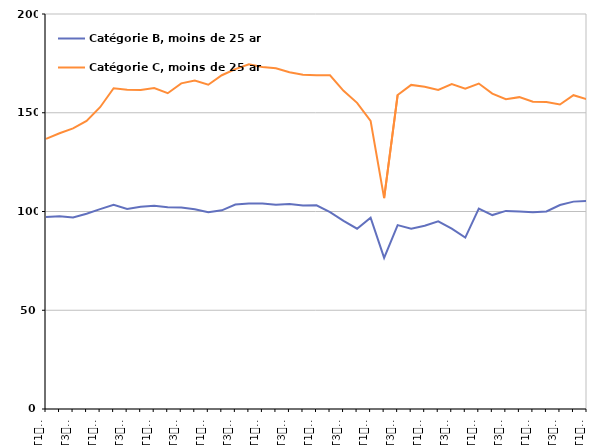
| Category | Catégorie B, moins de 25 ans | Catégorie C, moins de 25 ans |
|---|---|---|
| T1
2014 | 97.2 | 136.8 |
| T2
2014 | 97.6 | 139.6 |
| T3
2014 | 97 | 142.1 |
| T4
2014 | 98.9 | 145.9 |
| T1
2015 | 101.2 | 152.8 |
| T2
2015 | 103.4 | 162.4 |
| T3
2015 | 101.3 | 161.7 |
| T4
2015 | 102.4 | 161.5 |
| T1
2016 | 102.9 | 162.5 |
| T2
2016 | 102.2 | 159.9 |
| T3
2016 | 102 | 164.9 |
| T4
2016 | 101.1 | 166.3 |
| T1
2017 | 99.6 | 164.2 |
| T2
2017 | 100.6 | 169 |
| T3
2017 | 103.5 | 172.1 |
| T4
2017 | 104 | 174.5 |
| T1
2018 | 104.1 | 173.2 |
| T2
2018 | 103.4 | 172.5 |
| T3
2018 | 103.8 | 170.5 |
| T4
2018 | 103 | 169.3 |
| T1
2019 | 103.1 | 169 |
| T2
2019 | 99.7 | 169 |
| T3
2019 | 95.3 | 161.1 |
| T4
2019 | 91.3 | 155 |
| T1
2020 | 96.9 | 145.9 |
| T2
2020 | 76.5 | 106.8 |
| T3
2020 | 93.1 | 159 |
| T4
2020 | 91.3 | 164.1 |
| T1
2021 | 92.8 | 163.2 |
| T2
2021 | 95 | 161.5 |
| T3
2021 | 91.3 | 164.5 |
| T4
2021 | 86.8 | 162.2 |
| T1
2022 | 101.5 | 164.8 |
| T2
2022 | 98.2 | 159.7 |
| T3
2022 | 100.3 | 156.9 |
| T4
2022 | 100 | 157.9 |
| T1
2023 | 99.6 | 155.6 |
| T2
2023 | 100 | 155.4 |
| T3
2023 | 103.3 | 154.2 |
| T4
2023 | 105 | 158.9 |
| T1
2024 | 105.3 | 156.8 |